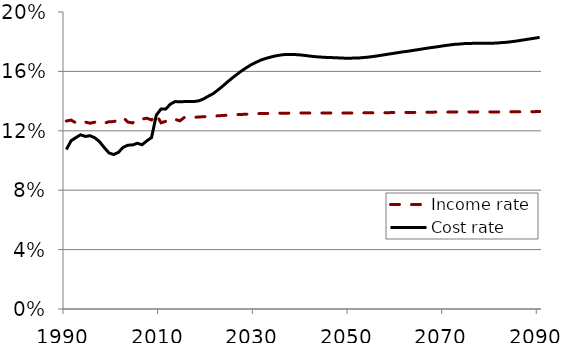
| Category | Income rate | Cost rate |
|---|---|---|
| 1990.0 | 0.127 | 0.107 |
| 1991.0 | 0.127 | 0.113 |
| 1992.0 | 0.125 | 0.115 |
| 1993.0 | 0.124 | 0.117 |
| 1994.0 | 0.126 | 0.116 |
| 1995.0 | 0.125 | 0.117 |
| 1996.0 | 0.126 | 0.115 |
| 1997.0 | 0.126 | 0.113 |
| 1998.0 | 0.125 | 0.109 |
| 1999.0 | 0.126 | 0.105 |
| 2000.0 | 0.126 | 0.104 |
| 2001.0 | 0.127 | 0.106 |
| 2002.0 | 0.129 | 0.109 |
| 2003.0 | 0.126 | 0.11 |
| 2004.0 | 0.125 | 0.11 |
| 2005.0 | 0.128 | 0.112 |
| 2006.0 | 0.128 | 0.111 |
| 2007.0 | 0.128 | 0.113 |
| 2008.0 | 0.127 | 0.116 |
| 2009.0 | 0.131 | 0.13 |
| 2010.0 | 0.125 | 0.135 |
| 2011.0 | 0.126 | 0.135 |
| 2012.0 | 0.128 | 0.138 |
| 2013.0 | 0.128 | 0.14 |
| 2014.0 | 0.127 | 0.139 |
| 2015.0 | 0.129 | 0.14 |
| 2016.0 | 0.129 | 0.14 |
| 2017.0 | 0.129 | 0.14 |
| 2018.0 | 0.129 | 0.14 |
| 2019.0 | 0.13 | 0.142 |
| 2020.0 | 0.13 | 0.143 |
| 2021.0 | 0.13 | 0.145 |
| 2022.0 | 0.13 | 0.147 |
| 2023.0 | 0.13 | 0.15 |
| 2024.0 | 0.13 | 0.153 |
| 2025.0 | 0.131 | 0.155 |
| 2026.0 | 0.131 | 0.158 |
| 2027.0 | 0.131 | 0.16 |
| 2028.0 | 0.131 | 0.162 |
| 2029.0 | 0.131 | 0.164 |
| 2030.0 | 0.132 | 0.166 |
| 2031.0 | 0.132 | 0.168 |
| 2032.0 | 0.132 | 0.169 |
| 2033.0 | 0.132 | 0.169 |
| 2034.0 | 0.132 | 0.17 |
| 2035.0 | 0.132 | 0.171 |
| 2036.0 | 0.132 | 0.171 |
| 2037.0 | 0.132 | 0.171 |
| 2038.0 | 0.132 | 0.171 |
| 2039.0 | 0.132 | 0.171 |
| 2040.0 | 0.132 | 0.171 |
| 2041.0 | 0.132 | 0.17 |
| 2042.0 | 0.132 | 0.17 |
| 2043.0 | 0.132 | 0.17 |
| 2044.0 | 0.132 | 0.17 |
| 2045.0 | 0.132 | 0.169 |
| 2046.0 | 0.132 | 0.169 |
| 2047.0 | 0.132 | 0.169 |
| 2048.0 | 0.132 | 0.169 |
| 2049.0 | 0.132 | 0.169 |
| 2050.0 | 0.132 | 0.169 |
| 2051.0 | 0.132 | 0.169 |
| 2052.0 | 0.132 | 0.169 |
| 2053.0 | 0.132 | 0.169 |
| 2054.0 | 0.132 | 0.17 |
| 2055.0 | 0.132 | 0.17 |
| 2056.0 | 0.132 | 0.171 |
| 2057.0 | 0.132 | 0.171 |
| 2058.0 | 0.132 | 0.172 |
| 2059.0 | 0.132 | 0.172 |
| 2060.0 | 0.132 | 0.173 |
| 2061.0 | 0.132 | 0.173 |
| 2062.0 | 0.132 | 0.174 |
| 2063.0 | 0.132 | 0.174 |
| 2064.0 | 0.132 | 0.174 |
| 2065.0 | 0.132 | 0.175 |
| 2066.0 | 0.132 | 0.176 |
| 2067.0 | 0.132 | 0.176 |
| 2068.0 | 0.133 | 0.176 |
| 2069.0 | 0.133 | 0.177 |
| 2070.0 | 0.133 | 0.177 |
| 2071.0 | 0.133 | 0.178 |
| 2072.0 | 0.133 | 0.178 |
| 2073.0 | 0.133 | 0.178 |
| 2074.0 | 0.133 | 0.179 |
| 2075.0 | 0.133 | 0.179 |
| 2076.0 | 0.133 | 0.179 |
| 2077.0 | 0.133 | 0.179 |
| 2078.0 | 0.133 | 0.179 |
| 2079.0 | 0.133 | 0.179 |
| 2080.0 | 0.133 | 0.179 |
| 2081.0 | 0.133 | 0.179 |
| 2082.0 | 0.133 | 0.179 |
| 2083.0 | 0.133 | 0.18 |
| 2084.0 | 0.133 | 0.18 |
| 2085.0 | 0.133 | 0.18 |
| 2086.0 | 0.133 | 0.181 |
| 2087.0 | 0.133 | 0.181 |
| 2088.0 | 0.133 | 0.182 |
| 2089.0 | 0.133 | 0.182 |
| 2090.0 | 0.133 | 0.183 |